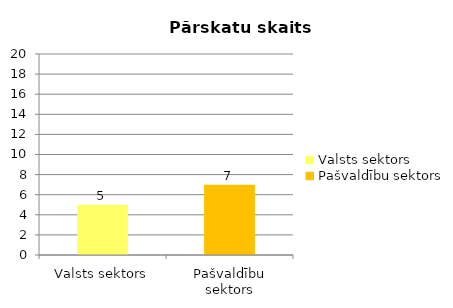
| Category |  Pārskatu skaits |
|---|---|
| Valsts sektors | 5 |
| Pašvaldību sektors | 7 |